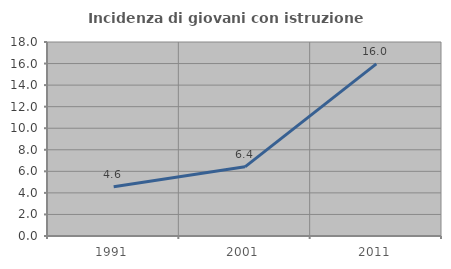
| Category | Incidenza di giovani con istruzione universitaria |
|---|---|
| 1991.0 | 4.566 |
| 2001.0 | 6.419 |
| 2011.0 | 15.976 |